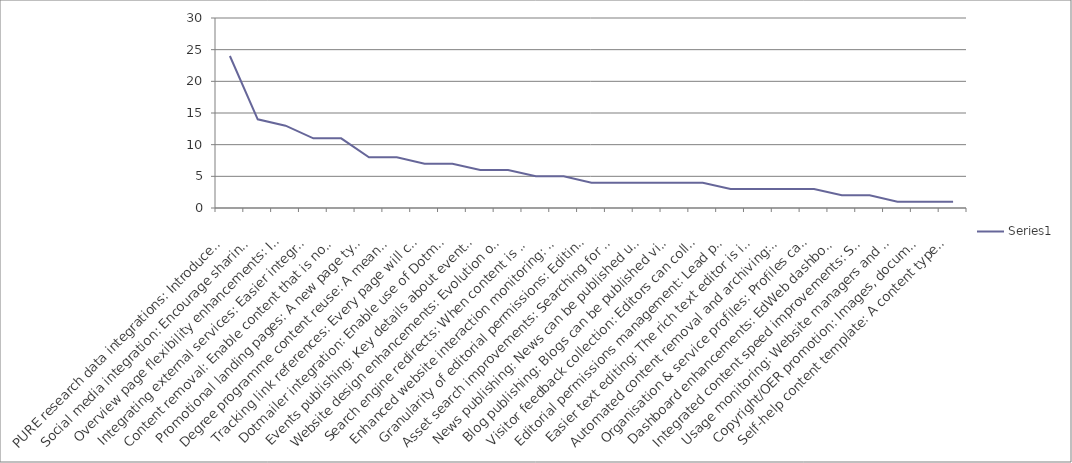
| Category | Series 0 |
|---|---|
| PURE research data integrations: Introduce more opportunities to present information from the Edinburgh Research Explorer in EdWeb-managed web pages, with no technical knowledge needed. (Currently only publication lists possible). | 24 |
| Social media integration: Encourage sharing of website content via social media buttons, and features to monitor engagement on popular networks. | 14 |
| Overview page flexibility enhancements: Introduce new layout options to enable overview pages to dynamically present the content below in a range of ways. | 13 |
| Integrating external services: Easier integration of services such as Google Maps, You Tube videos, Twitter feeds. Simple URL pasting into EdWeb with no need for interaction with HTML or assets. | 11 |
| Content removal: Enable content that is no longer required or created in error to be removable, reducing unnecessary clutter in the EdWeb content tree for editors. | 11 |
| Promotional landing pages: A new page type designed for promotional impact and flexibility, which can be used at any point in a site structure. It will work much like a Generic Content page, but have presentational features similar to a homepage. | 8 |
| Degree programme content reuse: A means to re-use and extend golden copy content about degree programmes, that is currently published only via the Degree Finder | 8 |
| Tracking link references: Every page will contain a list of all other EdWeb pages that link to it, so that when it is edited, moved or removed the editor is aware of the impact of their actions on other publishers across the University. | 7 |
| Dotmailer integration: Enable use of Dotmailer through EdWeb as a means to build and manage mailing lists more efficiently. | 7 |
| Events publishing: Key details about events can be displayed differently in different contexts, such as the automatic creation of an events calendar. | 6 |
| Website design enhancements: Evolution of design to improve website visitor experience on small devices, bringing greater focus to content over brand & navigation elements and promoting clearer/easier interactions. | 6 |
| Search engine redirects: When content is moved or removed, enable 301 redirects. This reduces the risk of a website visitor receiving a 'Page not found' error from a search result in the period before the site is re-indexed. | 5 |
| Enhanced website interaction monitoring: Enable use of analytics tools (click heat tracking, A/B testing etc) that provide additional insight into how website visitors are interacting with the website. This informs ongoing content & design improvements. | 5 |
| Granularity of editorial permissions: Editing rights can be restricted to particular subsections or content types, rather than having access to everything in a particular site. | 4 |
| Asset search improvements: Searching for images, documents, videos, content snippets etc is quicker, easier and more efficient. | 4 |
| News publishing: News can be published using a dedicated content type (template); enhancing presentation on different device sizes, allowing more intelligent sharing and promotion in search results. | 4 |
| Blog publishing: Blogs can be published via EdWeb, with sufficient design changes to distinguish from corporate web content, and new navigation and filtering options typically associated with this kind of content (sort by author, by date, by tag etc). | 4 |
| Visitor feedback collection: Editors can collect and view visitor ratings for page content, to identify strengths and quickly correct any errors. | 4 |
| Editorial permissions management: Lead publishers can assign editorial rights on their website to any trained user, without involving EdWeb support. | 3 |
| Easier text editing: The rich text editor is improved, so that it's quicker and easier to make changes to content, to apply stand-out formatting elements and to ensure everything is standards compliant. | 3 |
| Automated content removal and archiving: Schedule archiving and permanent removal of unpublished content after given periods to reduce unnecessary clutter and support compliance with records management legislation. | 3 |
| Organisation & service profiles: Profiles can be published using a dedicated content type (template); enhancing presentation on different device sizes, allowing more intelligent sharing and promotion in search results. | 3 |
| Dashboard enhancements: EdWeb dashboard is more useful to editors and publishers, speeding up completion of the most common tasks, and can be configured to suit an individual's priorities. | 2 |
| Integrated content speed improvements: Speed up page load times for content being delivered from external systems through EdWeb. | 2 |
| Usage monitoring: Website managers and EdWeb support services have access to data on editorial and publishing activity, which will support better website management, staffing and user support-related decision making. | 1 |
| Copyright/OER promotion: Images, documents and other assets can be promoted as Open Educational Resources, encouraging reuse of University materials worldwide. | 1 |
| Self-help content template: A content type (template) optimised for presentation of online help and guidance, supporting user self service. | 1 |